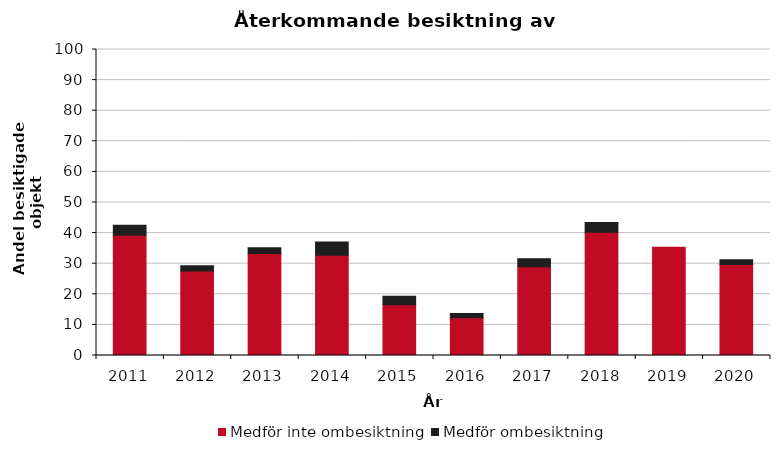
| Category | Medför inte ombesiktning | Medför ombesiktning |
|---|---|---|
| 2011.0 | 39.3 | 3.3 |
| 2012.0 | 27.6 | 1.7 |
| 2013.0 | 33.3 | 1.9 |
| 2014.0 | 32.8 | 4.3 |
| 2015.0 | 16.6 | 2.8 |
| 2016.0 | 12.3 | 1.4 |
| 2017.0 | 29 | 2.6 |
| 2018.0 | 40.3 | 3.2 |
| 2019.0 | 35.4 | 0 |
| 2020.0 | 29.7 | 1.6 |